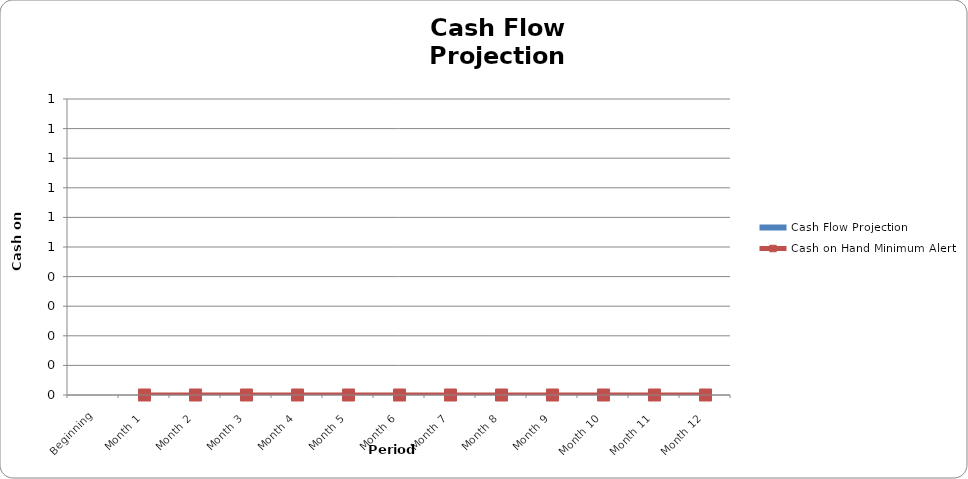
| Category | Cash Flow Projection |
|---|---|
| Beginning | 0 |
| Month 1 | 0 |
| Month 2 | 0 |
| Month 3 | 0 |
| Month 4 | 0 |
| Month 5 | 0 |
| Month 6 | 0 |
| Month 7 | 0 |
| Month 8 | 0 |
| Month 9 | 0 |
| Month 10 | 0 |
| Month 11 | 0 |
| Month 12 | 0 |